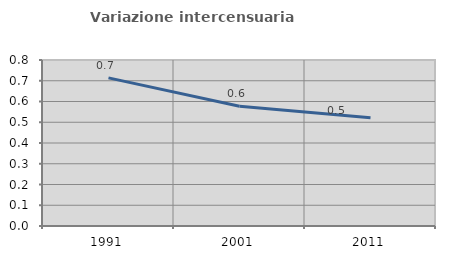
| Category | Variazione intercensuaria annua |
|---|---|
| 1991.0 | 0.714 |
| 2001.0 | 0.577 |
| 2011.0 | 0.521 |